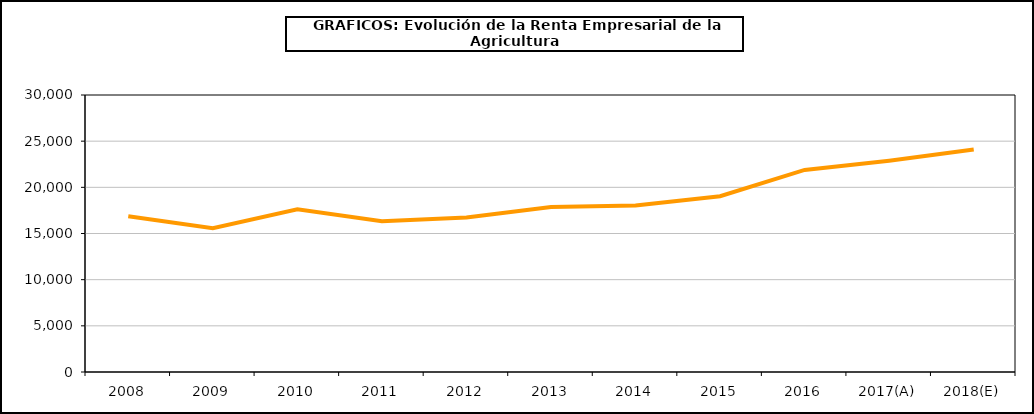
| Category | renta empresarial |
|---|---|
| 2008 | 16877.818 |
| 2009 | 15568.835 |
| 2010 | 17633.246 |
| 2011 | 16322.948 |
| 2012 | 16739.148 |
| 2013 | 17858.951 |
| 2014 | 18029.917 |
| 2015 | 19041.49 |
| 2016 | 21888.067 |
| 2017(A) | 22888.135 |
| 2018(E) | 24087.865 |